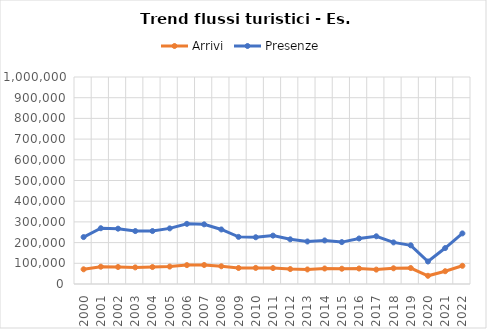
| Category | Arrivi | Presenze |
|---|---|---|
| 2000.0 | 71015 | 226686 |
| 2001.0 | 83506 | 269395 |
| 2002.0 | 82148 | 267324 |
| 2003.0 | 80197 | 255694 |
| 2004.0 | 81933 | 255808 |
| 2005.0 | 84214 | 268679 |
| 2006.0 | 91196 | 290576 |
| 2007.0 | 91829 | 288164 |
| 2008.0 | 85638 | 263499 |
| 2009.0 | 77275 | 227630 |
| 2010.0 | 77754 | 225821 |
| 2011.0 | 76843 | 233722 |
| 2012.0 | 72167 | 215833 |
| 2013.0 | 70273 | 205421 |
| 2014.0 | 74862 | 210459 |
| 2015.0 | 73766 | 202419 |
| 2016.0 | 74819 | 219775 |
| 2017.0 | 69482 | 230492 |
| 2018.0 | 75862 | 200949 |
| 2019.0 | 77231 | 186900 |
| 2020.0 | 39669 | 108708 |
| 2021.0 | 61784 | 173661 |
| 2022.0 | 87921 | 244446 |